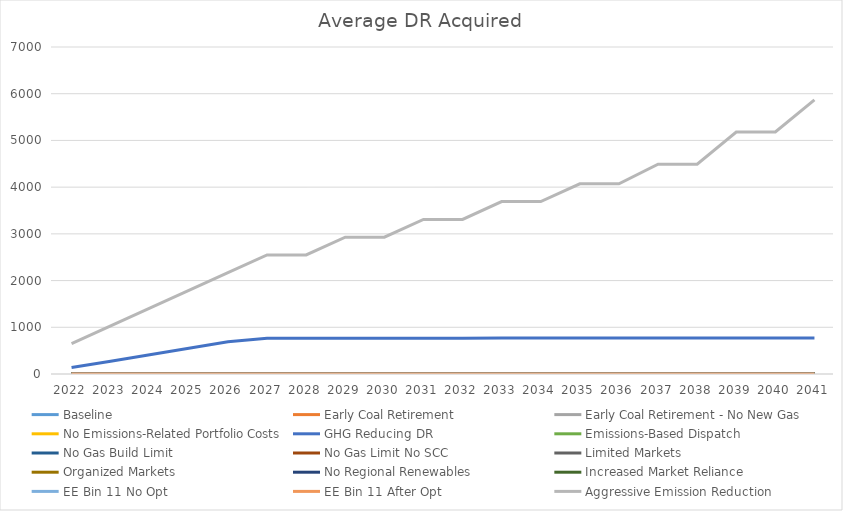
| Category | Baseline  | Early Coal Retirement | Early Coal Retirement - No New Gas | No Emissions-Related Portfolio Costs | GHG Reducing DR | Emissions-Based Dispatch | No Gas Build Limit | No Gas Limit No SCC | Limited Markets | Organized Markets | No Regional Renewables | Increased Market Reliance | EE Bin 11 No Opt | EE Bin 11 After Opt | Aggressive Emission Reduction |
|---|---|---|---|---|---|---|---|---|---|---|---|---|---|---|---|
| 2022.0 | 0 | 0 | 0 | 0 | 137.2 | 0 | 0 | 0 | 0 | 0 | 0 | 0 | 0 | 0 | 650 |
| 2023.0 | 0 | 0 | 0 | 0 | 273.933 | 0 | 0 | 0 | 0 | 0 | 0 | 0 | 0 | 0 | 1030 |
| 2024.0 | 0 | 0 | 0 | 0 | 412.067 | 0 | 0 | 0 | 0 | 0 | 0 | 0 | 0 | 0 | 1410 |
| 2025.0 | 0 | 0 | 0 | 0 | 552.067 | 0 | 0 | 0 | 0 | 0 | 0 | 0 | 0 | 0 | 1790 |
| 2026.0 | 0 | 0 | 0 | 0 | 691.6 | 0 | 0 | 0 | 0 | 0 | 0 | 0 | 0 | 0 | 2170 |
| 2027.0 | 0 | 0 | 0 | 0 | 763 | 0 | 0 | 0 | 0 | 0 | 0 | 0 | 0 | 0 | 2550 |
| 2028.0 | 0 | 0 | 0 | 0 | 763 | 0 | 0 | 0 | 0 | 0 | 0 | 0 | 0 | 0 | 2550 |
| 2029.0 | 0 | 0 | 0 | 0 | 766.3 | 0 | 0 | 0 | 0 | 0 | 0 | 0 | 0 | 0 | 2930 |
| 2030.0 | 0 | 0 | 0 | 0 | 766.3 | 0 | 0 | 0 | 0 | 0 | 0 | 0 | 0 | 0 | 2930 |
| 2031.0 | 0 | 0 | 0 | 0 | 767.8 | 0 | 0 | 0 | 0 | 0 | 0 | 0 | 0 | 0 | 3310 |
| 2032.0 | 0 | 0 | 0 | 0 | 767.8 | 0 | 0 | 0 | 0 | 0 | 0 | 0 | 0 | 0 | 3310 |
| 2033.0 | 0 | 0 | 0 | 0 | 768.8 | 0 | 0 | 0 | 0 | 0 | 0 | 0 | 0 | 0 | 3690 |
| 2034.0 | 0 | 0 | 0 | 0 | 768.8 | 0 | 0 | 0 | 0 | 0 | 0 | 0 | 0 | 0 | 3690 |
| 2035.0 | 0 | 0 | 0 | 0 | 769.233 | 0 | 0 | 0 | 0 | 0 | 0 | 0 | 0 | 0 | 4070 |
| 2036.0 | 0 | 0 | 0 | 0 | 769.233 | 0 | 0 | 0 | 0 | 0 | 0 | 0 | 0 | 0 | 4070 |
| 2037.0 | 0 | 0 | 0 | 0 | 769.667 | 0 | 0 | 0 | 0 | 0 | 0 | 0 | 0 | 0 | 4490 |
| 2038.0 | 0 | 0 | 0 | 0 | 769.667 | 0 | 0 | 0 | 0 | 0 | 0 | 0 | 0 | 0 | 4490 |
| 2039.0 | 0 | 0 | 0 | 0 | 770 | 0 | 0 | 0 | 0 | 0 | 0 | 0 | 0 | 0 | 5180 |
| 2040.0 | 0 | 0 | 0 | 0 | 770 | 0 | 0 | 0 | 0 | 0 | 0 | 0 | 0 | 0 | 5180 |
| 2041.0 | 0 | 0 | 0 | 5.2 | 770 | 5.567 | 5.2 | 5.2 | 0 | 0 | 1.3 | 0 | 0 | 0 | 5870 |